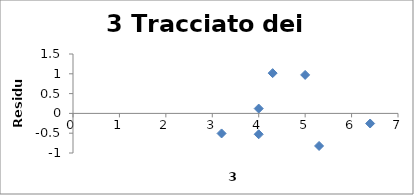
| Category | Series 0 |
|---|---|
| 3.2 | -0.506 |
| 4.0 | -0.527 |
| 4.3 | 1.017 |
| 5.0 | 0.972 |
| 5.3 | -0.822 |
| 6.4 | -0.255 |
| 4.0 | 0.123 |